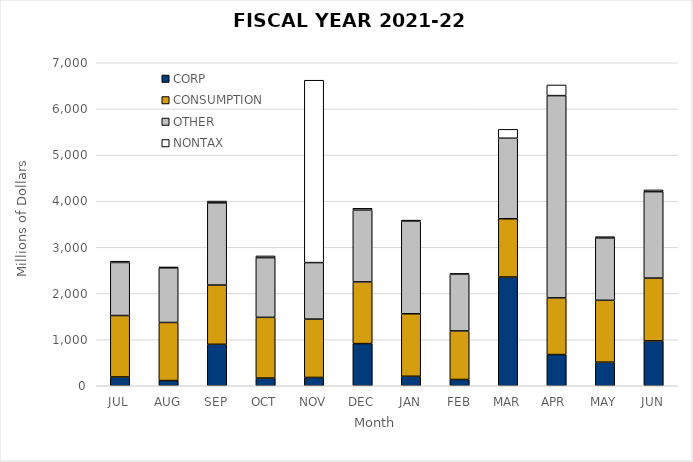
| Category | CORP | CONSUMPTION | OTHER | NONTAX |
|---|---|---|---|---|
| JUL | 190.482 | 1331.433 | 1149.897 | 28.405 |
| AUG | 112.065 | 1258.875 | 1185.043 | 18.295 |
| SEP | 898.163 | 1284.098 | 1781.707 | 39.137 |
| OCT | 165.965 | 1316.761 | 1294.391 | 37.008 |
| NOV | 180.217 | 1263.775 | 1225.318 | 3952.142 |
| DEC | 913.413 | 1337.005 | 1556.516 | 39.041 |
| JAN | 205.283 | 1355.154 | 2007.084 | 21.881 |
| FEB | 136.064 | 1051.908 | 1227.498 | 18.879 |
| MAR | 2356.395 | 1263.03 | 1745.131 | 192.49 |
| APR  | 676.07 | 1227.86 | 4384.101 | 230.64 |
| MAY | 510.856 | 1340.738 | 1349.788 | 29.695 |
| JUN | 972.009 | 1360.838 | 1873.712 | 37.963 |